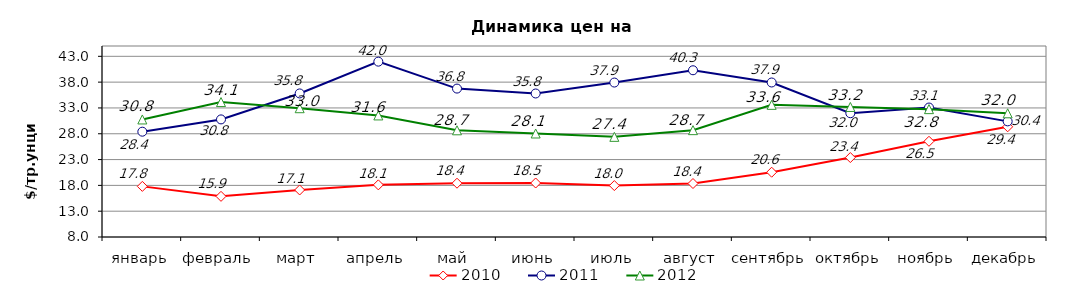
| Category | 2010 | 2011 | 2012 |
|---|---|---|---|
| январь | 17.806 | 28.4 | 30.77 |
| февраль | 15.873 | 30.78 | 34.14 |
| март | 17.11 | 35.81 | 32.95 |
| апрель | 18.1 | 41.97 | 31.55 |
| май | 18.42 | 36.75 | 28.67 |
| июнь | 18.46 | 35.8 | 28.05 |
| июль | 17.96 | 37.92 | 27.4 |
| август | 18.36 | 40.3 | 28.7 |
| сентябрь | 20.55 | 37.93 | 33.6 |
| октябрь | 23.39 | 31.975 | 33.19 |
| ноябрь | 26.54 | 33.08 | 32.77 |
| декабрь | 29.35 | 30.4 | 31.96 |